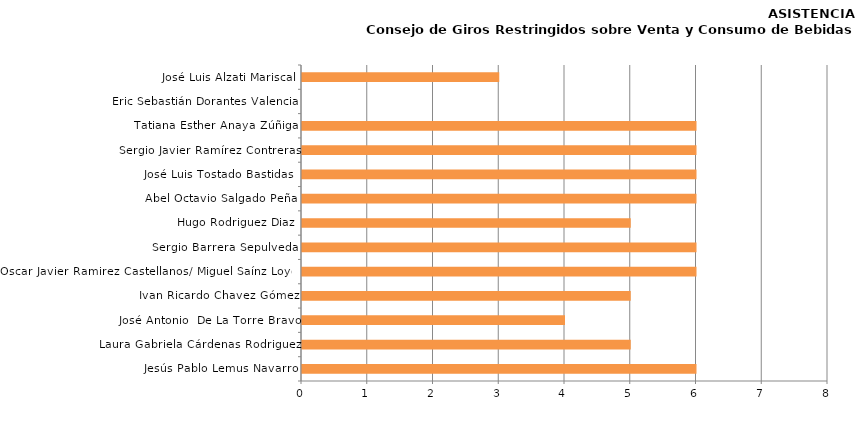
| Category | Series 0 |
|---|---|
| Jesús Pablo Lemus Navarro | 6 |
| Laura Gabriela Cárdenas Rodriguez | 5 |
| José Antonio  De La Torre Bravo | 4 |
| Ivan Ricardo Chavez Gómez | 5 |
| Oscar Javier Ramirez Castellanos/ Miguel Saínz Loyola | 6 |
| Sergio Barrera Sepulveda | 6 |
| Hugo Rodriguez Diaz | 5 |
| Abel Octavio Salgado Peña | 6 |
| José Luis Tostado Bastidas  | 6 |
| Sergio Javier Ramírez Contreras | 6 |
| Tatiana Esther Anaya Zúñiga | 6 |
| Eric Sebastián Dorantes Valencia | 0 |
| José Luis Alzati Mariscal | 3 |